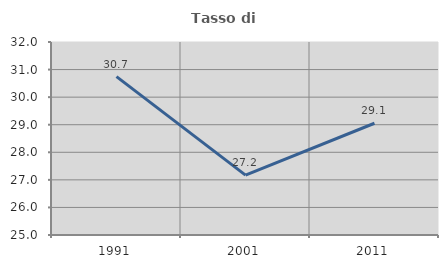
| Category | Tasso di occupazione   |
|---|---|
| 1991.0 | 30.745 |
| 2001.0 | 27.172 |
| 2011.0 | 29.053 |